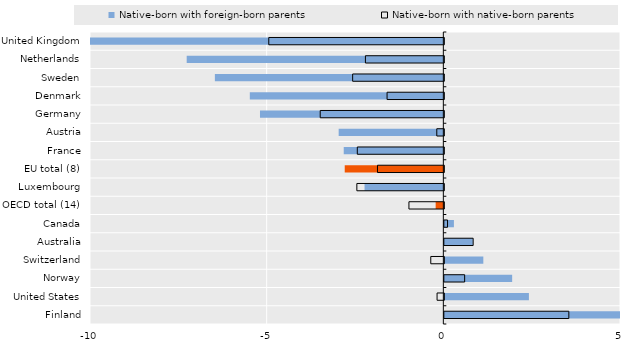
| Category | Native-born with foreign-born parents | Native-born with native-born parents |
|---|---|---|
| United Kingdom | -10.031 | -4.954 |
| Netherlands | -7.263 | -2.22 |
| Sweden | -6.466 | -2.581 |
| Denmark | -5.477 | -1.607 |
| Germany | -5.189 | -3.499 |
| Austria | -2.962 | -0.199 |
| France | -2.819 | -2.449 |
| EU total (8) | -2.791 | -1.878 |
| Luxembourg | -2.23 | -2.462 |
| OECD total (14) | -0.217 | -0.988 |
| Canada | 0.271 | 0.091 |
| Australia | 0.808 | 0.816 |
| Switzerland | 1.104 | -0.369 |
| Norway | 1.92 | 0.575 |
| United States | 2.393 | -0.191 |
| Finland | 11.135 | 3.524 |